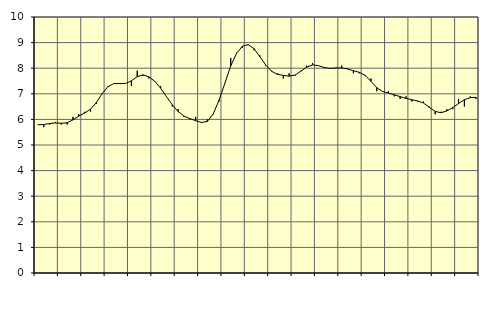
| Category | Piggar | Series 1 |
|---|---|---|
| nan | 5.8 | 5.79 |
| 1.0 | 5.7 | 5.8 |
| 1.0 | 5.8 | 5.84 |
| 1.0 | 5.9 | 5.86 |
| nan | 5.8 | 5.85 |
| 2.0 | 5.8 | 5.87 |
| 2.0 | 6.1 | 5.98 |
| 2.0 | 6.2 | 6.13 |
| nan | 6.3 | 6.25 |
| 3.0 | 6.3 | 6.4 |
| 3.0 | 6.6 | 6.66 |
| 3.0 | 7 | 7.01 |
| nan | 7.3 | 7.28 |
| 4.0 | 7.4 | 7.4 |
| 4.0 | 7.4 | 7.4 |
| 4.0 | 7.4 | 7.4 |
| nan | 7.3 | 7.51 |
| 5.0 | 7.9 | 7.67 |
| 5.0 | 7.7 | 7.74 |
| 5.0 | 7.6 | 7.66 |
| nan | 7.5 | 7.49 |
| 6.0 | 7.3 | 7.22 |
| 6.0 | 6.9 | 6.89 |
| 6.0 | 6.5 | 6.57 |
| nan | 6.4 | 6.31 |
| 7.0 | 6.1 | 6.13 |
| 7.0 | 6 | 6.03 |
| 7.0 | 6.1 | 5.95 |
| nan | 5.9 | 5.88 |
| 8.0 | 6 | 5.92 |
| 8.0 | 6.2 | 6.21 |
| 8.0 | 6.7 | 6.75 |
| nan | 7.4 | 7.41 |
| 9.0 | 8.4 | 8.09 |
| 9.0 | 8.6 | 8.58 |
| 9.0 | 8.8 | 8.86 |
| nan | 8.9 | 8.92 |
| 10.0 | 8.7 | 8.76 |
| 10.0 | 8.5 | 8.45 |
| 10.0 | 8.1 | 8.12 |
| nan | 7.9 | 7.88 |
| 11.0 | 7.8 | 7.76 |
| 11.0 | 7.6 | 7.72 |
| 11.0 | 7.8 | 7.69 |
| nan | 7.7 | 7.73 |
| 12.0 | 7.9 | 7.88 |
| 12.0 | 8.1 | 8.04 |
| 12.0 | 8.2 | 8.13 |
| nan | 8.1 | 8.1 |
| 13.0 | 8 | 8.03 |
| 13.0 | 8 | 7.99 |
| 13.0 | 8 | 8.01 |
| nan | 8.1 | 8.01 |
| 14.0 | 8 | 7.97 |
| 14.0 | 7.8 | 7.9 |
| 14.0 | 7.8 | 7.84 |
| nan | 7.7 | 7.72 |
| 15.0 | 7.6 | 7.49 |
| 15.0 | 7.1 | 7.24 |
| 15.0 | 7.1 | 7.09 |
| nan | 7.1 | 7.03 |
| 16.0 | 6.9 | 6.96 |
| 16.0 | 6.8 | 6.89 |
| 16.0 | 6.9 | 6.82 |
| nan | 6.7 | 6.77 |
| 17.0 | 6.7 | 6.72 |
| 17.0 | 6.7 | 6.64 |
| 17.0 | 6.5 | 6.47 |
| nan | 6.2 | 6.31 |
| 18.0 | 6.3 | 6.26 |
| 18.0 | 6.4 | 6.33 |
| 18.0 | 6.4 | 6.46 |
| nan | 6.8 | 6.62 |
| 19.0 | 6.5 | 6.77 |
| 19.0 | 6.9 | 6.85 |
| 19.0 | 6.8 | 6.86 |